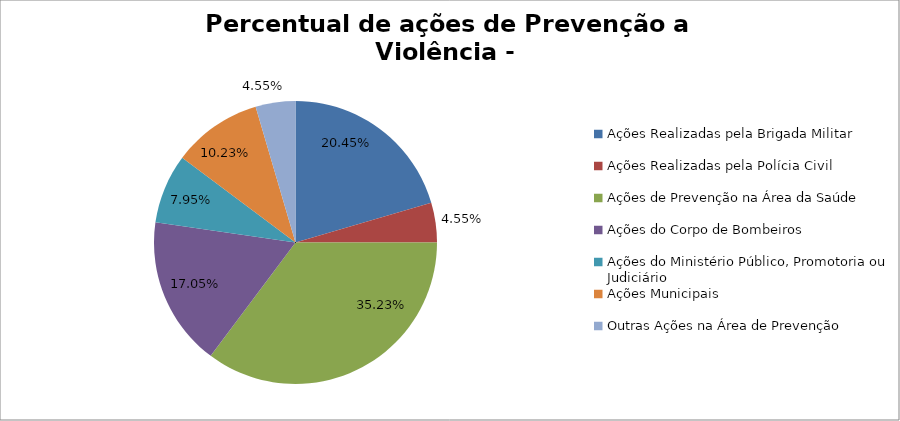
| Category | Percentual |
|---|---|
| Ações Realizadas pela Brigada Militar | 0.205 |
| Ações Realizadas pela Polícia Civil | 0.045 |
| Ações de Prevenção na Área da Saúde | 0.352 |
| Ações do Corpo de Bombeiros | 0.17 |
| Ações do Ministério Público, Promotoria ou Judiciário | 0.08 |
| Ações Municipais | 0.102 |
| Outras Ações na Área de Prevenção | 0.045 |